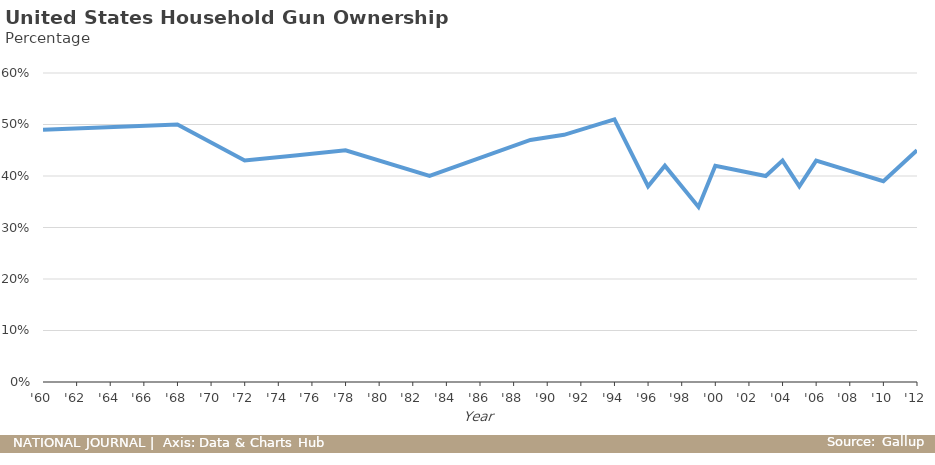
| Category | Total |
|---|---|
| 2012-12-31 | 0.45 |
| 2010-12-31 | 0.39 |
| 2006-12-31 | 0.43 |
| 2005-12-31 | 0.38 |
| 2004-12-31 | 0.43 |
| 2003-12-31 | 0.4 |
| 2000-12-31 | 0.42 |
| 1999-12-31 | 0.34 |
| 1997-12-31 | 0.42 |
| 1996-12-31 | 0.38 |
| 1994-12-31 | 0.51 |
| 1991-12-31 | 0.48 |
| 1989-12-31 | 0.47 |
| 1983-12-31 | 0.4 |
| 1978-12-31 | 0.45 |
| 1975-12-31 | 0.44 |
| 1972-12-31 | 0.43 |
| 1968-12-31 | 0.5 |
| 1960-12-31 | 0.49 |